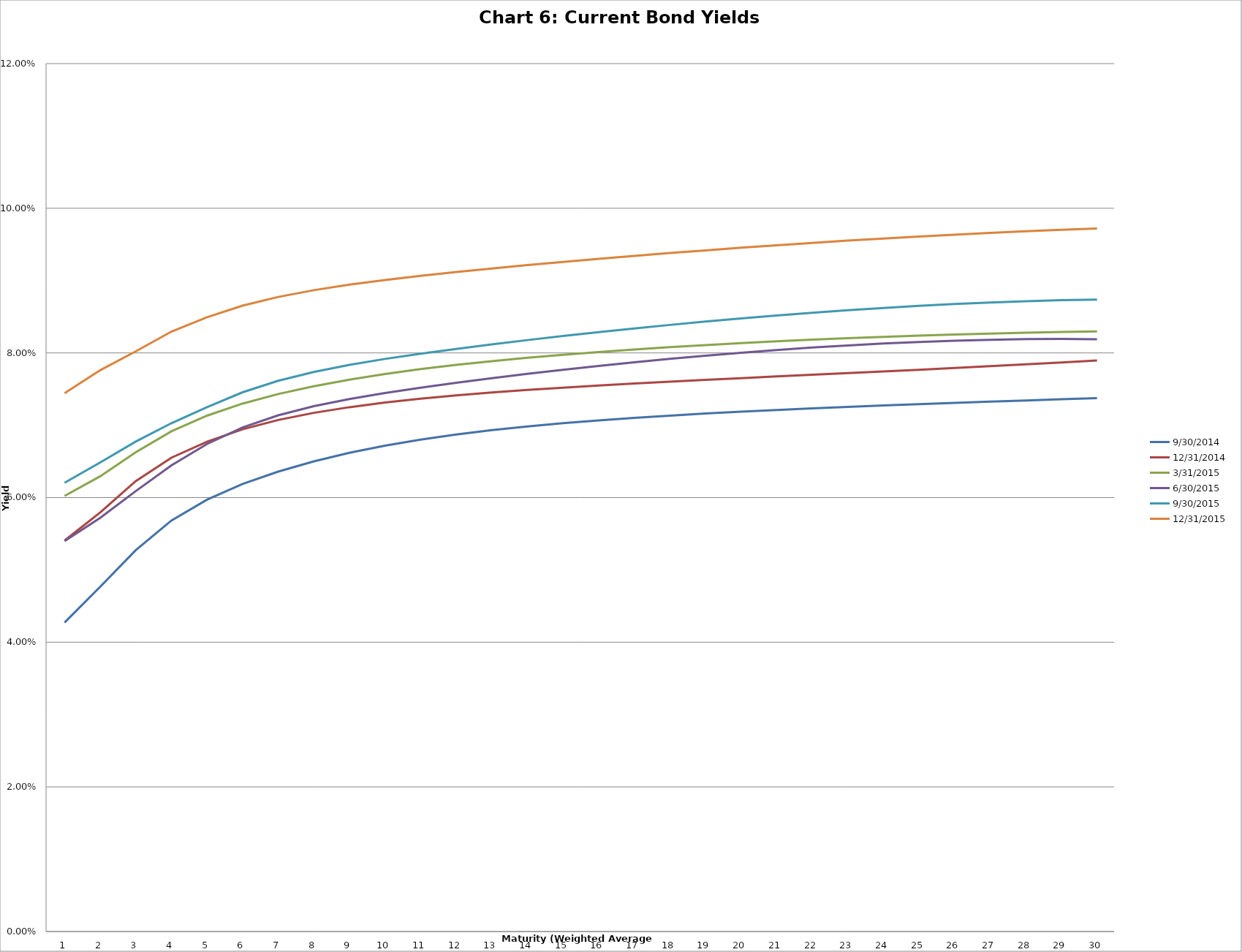
| Category | 9/30/2014 | 12/31/2014 | 3/31/2015 | 6/30/2015 | 9/30/2015 | 12/31/2015 |
|---|---|---|---|---|---|---|
| 0 | 0.043 | 0.054 | 0.06 | 0.054 | 0.062 | 0.074 |
| 1 | 0.048 | 0.058 | 0.063 | 0.057 | 0.065 | 0.078 |
| 2 | 0.053 | 0.062 | 0.066 | 0.061 | 0.068 | 0.08 |
| 3 | 0.057 | 0.066 | 0.069 | 0.064 | 0.07 | 0.083 |
| 4 | 0.06 | 0.068 | 0.071 | 0.067 | 0.072 | 0.085 |
| 5 | 0.062 | 0.069 | 0.073 | 0.07 | 0.075 | 0.087 |
| 6 | 0.064 | 0.071 | 0.074 | 0.071 | 0.076 | 0.088 |
| 7 | 0.065 | 0.072 | 0.075 | 0.073 | 0.077 | 0.089 |
| 8 | 0.066 | 0.072 | 0.076 | 0.074 | 0.078 | 0.089 |
| 9 | 0.067 | 0.073 | 0.077 | 0.074 | 0.079 | 0.09 |
| 10 | 0.068 | 0.074 | 0.078 | 0.075 | 0.08 | 0.091 |
| 11 | 0.069 | 0.074 | 0.078 | 0.076 | 0.081 | 0.091 |
| 12 | 0.069 | 0.075 | 0.079 | 0.076 | 0.081 | 0.092 |
| 13 | 0.07 | 0.075 | 0.079 | 0.077 | 0.082 | 0.092 |
| 14 | 0.07 | 0.075 | 0.08 | 0.078 | 0.082 | 0.093 |
| 15 | 0.071 | 0.075 | 0.08 | 0.078 | 0.083 | 0.093 |
| 16 | 0.071 | 0.076 | 0.08 | 0.079 | 0.083 | 0.093 |
| 17 | 0.071 | 0.076 | 0.081 | 0.079 | 0.084 | 0.094 |
| 18 | 0.072 | 0.076 | 0.081 | 0.08 | 0.084 | 0.094 |
| 19 | 0.072 | 0.077 | 0.081 | 0.08 | 0.085 | 0.095 |
| 20 | 0.072 | 0.077 | 0.082 | 0.08 | 0.085 | 0.095 |
| 21 | 0.072 | 0.077 | 0.082 | 0.081 | 0.086 | 0.095 |
| 22 | 0.073 | 0.077 | 0.082 | 0.081 | 0.086 | 0.096 |
| 23 | 0.073 | 0.077 | 0.082 | 0.081 | 0.086 | 0.096 |
| 24 | 0.073 | 0.078 | 0.082 | 0.082 | 0.087 | 0.096 |
| 25 | 0.073 | 0.078 | 0.083 | 0.082 | 0.087 | 0.096 |
| 26 | 0.073 | 0.078 | 0.083 | 0.082 | 0.087 | 0.097 |
| 27 | 0.073 | 0.078 | 0.083 | 0.082 | 0.087 | 0.097 |
| 28 | 0.074 | 0.079 | 0.083 | 0.082 | 0.087 | 0.097 |
| 29 | 0.074 | 0.079 | 0.083 | 0.082 | 0.087 | 0.097 |